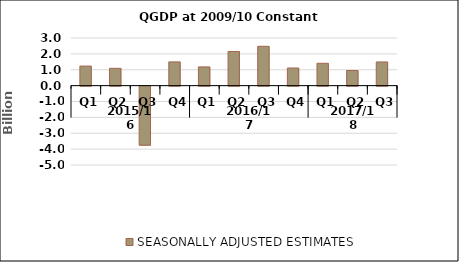
| Category | SEASONALLY ADJUSTED ESTIMATES |
|---|---|
| 0 | 1.233 |
| 1 | 1.089 |
| 2 | -3.719 |
| 3 | 1.495 |
| 4 | 1.179 |
| 5 | 2.151 |
| 6 | 2.476 |
| 7 | 1.11 |
| 8 | 1.406 |
| 9 | 0.952 |
| 10 | 1.491 |